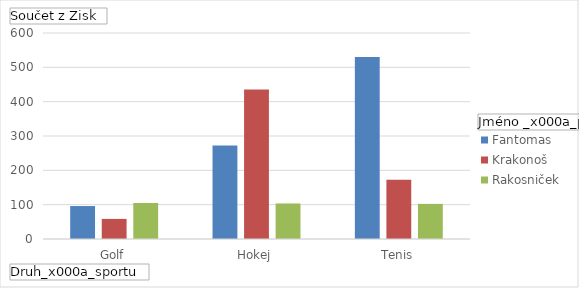
| Category | Fantomas | Krakonoš | Rakosniček |
|---|---|---|---|
| Golf | 96 | 58.5 | 105 |
| Hokej | 272 | 435.2 | 103.5 |
| Tenis | 530.4 | 172.8 | 102.3 |